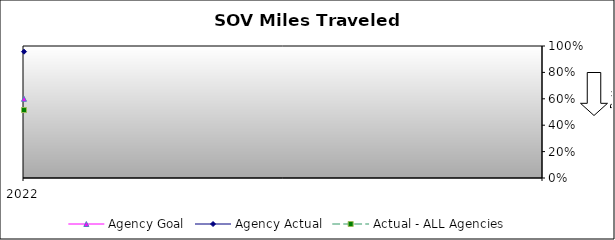
| Category | Agency Goal | Agency Actual | Actual - ALL Agencies |
|---|---|---|---|
| 2022.0 | 0.6 | 0.957 | 0.515 |